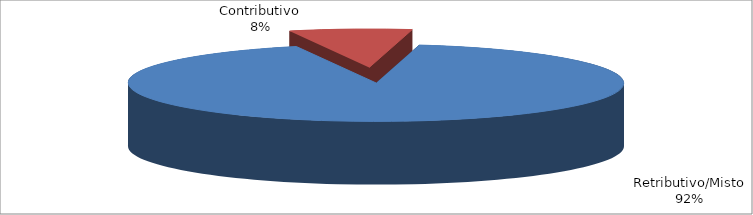
| Category | Decorrenti ANNO 2022 |
|---|---|
| Retributivo/Misto | 290770 |
| Contributivo | 25231 |